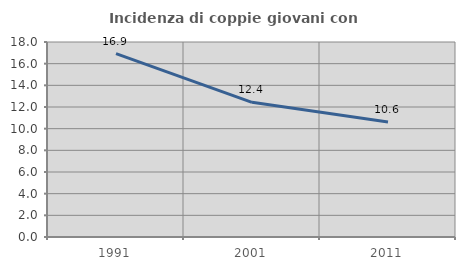
| Category | Incidenza di coppie giovani con figli |
|---|---|
| 1991.0 | 16.928 |
| 2001.0 | 12.432 |
| 2011.0 | 10.622 |